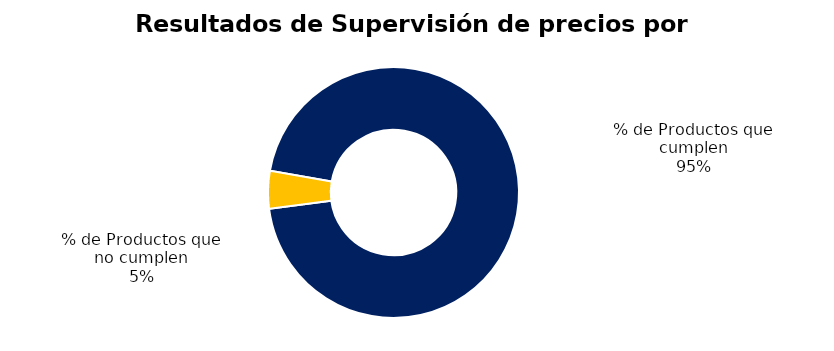
| Category | Series 0 |
|---|---|
| % de Productos que cumplen | 98 |
| % de Productos que no cumplen | 5 |